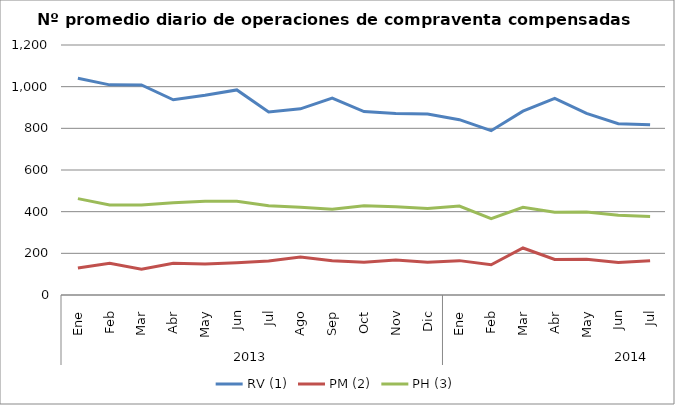
| Category | RV (1) | PM (2) | PH (3) |
|---|---|---|---|
| 0 | 1040.636 | 129.682 | 462.545 |
| 1 | 1008.7 | 152.35 | 432.05 |
| 2 | 1008.45 | 123.6 | 431.9 |
| 3 | 937.091 | 152.273 | 442.545 |
| 4 | 958.381 | 148.429 | 449.571 |
| 5 | 984.3 | 154.95 | 450 |
| 6 | 878.955 | 163.091 | 427.955 |
| 7 | 893.762 | 182.333 | 420.857 |
| 8 | 945.278 | 164.944 | 411.222 |
| 9 | 880.5 | 156.955 | 428.864 |
| 10 | 871.35 | 167.95 | 423.25 |
| 11 | 868.85 | 156.75 | 415.75 |
| 12 | 841.591 | 164.955 | 427.091 |
| 13 | 788.8 | 144.95 | 366.85 |
| 14 | 882.238 | 225.667 | 421.238 |
| 15 | 944 | 170.238 | 397.381 |
| 16 | 871.55 | 171.45 | 398.25 |
| 17 | 822.476 | 155.857 | 382.905 |
| 18 | 816.818 | 164.682 | 376.318 |